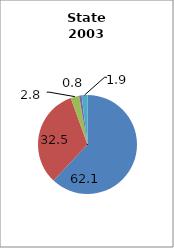
| Category | Arkansas |
|---|---|
| White | 62.05 |
| Black | 32.463 |
| Hispanic | 2.77 |
| Two or More Races | 0.806 |
| All Other1 | 1.911 |